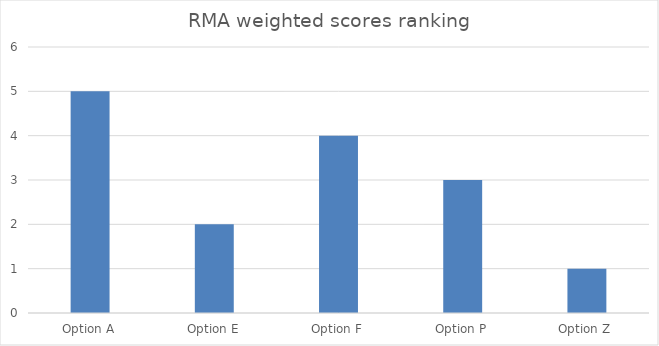
| Category | Series 0 |
|---|---|
| Option A | 5 |
| Option E | 2 |
| Option F | 4 |
| Option P | 3 |
| Option Z | 1 |